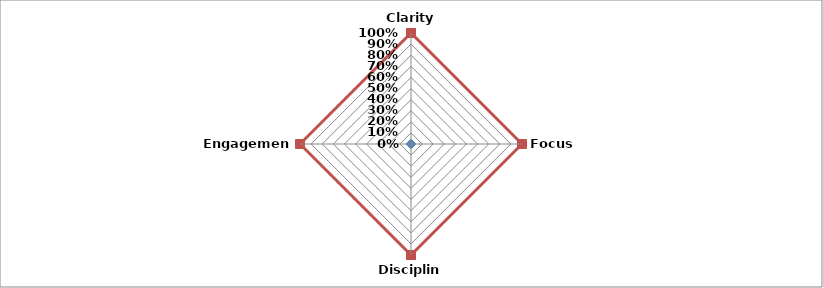
| Category | Overall % | Goal |
|---|---|---|
| Clarity | 0 | 1 |
| Focus | 0 | 1 |
| Discipline | 0 | 1 |
| Engagement | 0 | 1 |